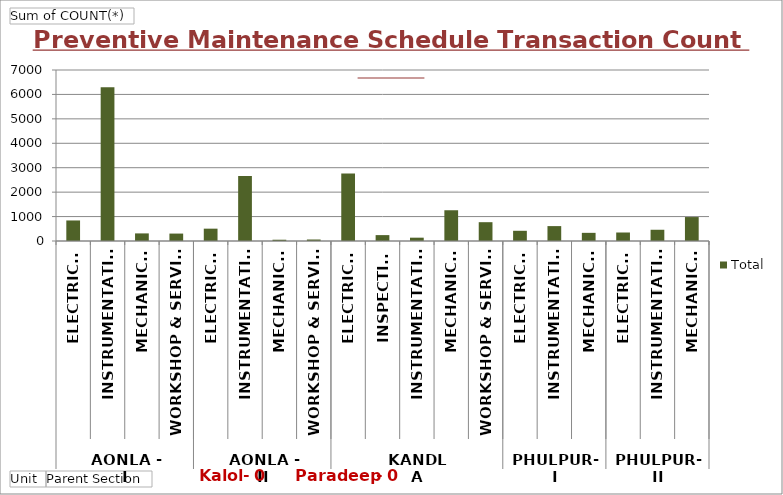
| Category | Total |
|---|---|
| 0 | 841 |
| 1 | 6291 |
| 2 | 311 |
| 3 | 304 |
| 4 | 505 |
| 5 | 2657 |
| 6 | 52 |
| 7 | 61 |
| 8 | 2759 |
| 9 | 241 |
| 10 | 136 |
| 11 | 1259 |
| 12 | 770 |
| 13 | 418 |
| 14 | 610 |
| 15 | 334 |
| 16 | 348 |
| 17 | 460 |
| 18 | 980 |